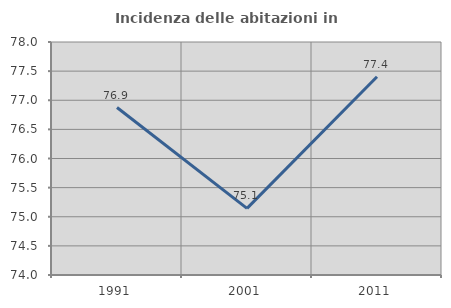
| Category | Incidenza delle abitazioni in proprietà  |
|---|---|
| 1991.0 | 76.875 |
| 2001.0 | 75.145 |
| 2011.0 | 77.404 |